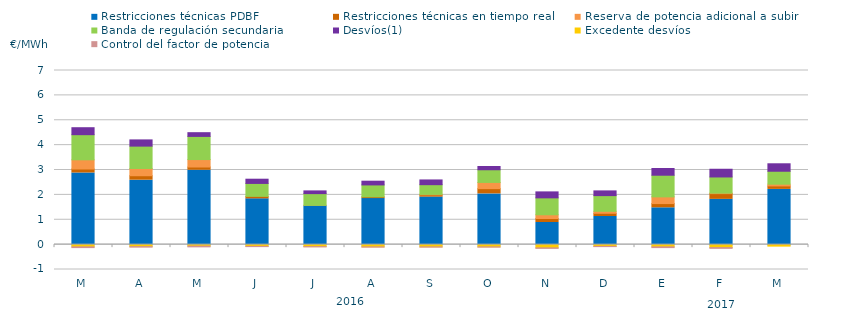
| Category | Restricciones técnicas PDBF | Restricciones técnicas en tiempo real | Reserva de potencia adicional a subir | Banda de regulación secundaria | Desvíos(1) | Excedente desvíos | Control del factor de potencia |
|---|---|---|---|---|---|---|---|
| M | 2.88 | 0.16 | 0.37 | 1.01 | 0.28 | -0.09 | -0.07 |
| A | 2.59 | 0.18 | 0.29 | 0.9 | 0.25 | -0.08 | -0.06 |
| M | 2.99 | 0.13 | 0.3 | 0.93 | 0.15 | -0.06 | -0.07 |
| J | 1.84 | 0.1 | 0 | 0.52 | 0.17 | -0.07 | -0.05 |
| J | 1.55 | 0.03 | 0 | 0.47 | 0.11 | -0.08 | -0.05 |
| A | 1.85 | 0.07 | 0 | 0.48 | 0.15 | -0.09 | -0.05 |
| S | 1.91 | 0.09 | 0.02 | 0.39 | 0.19 | -0.09 | -0.05 |
| O | 2.04 | 0.21 | 0.25 | 0.51 | 0.13 | -0.09 | -0.05 |
| N | 0.89 | 0.16 | 0.15 | 0.68 | 0.24 | -0.13 | -0.06 |
| D | 1.13 | 0.13 | 0.08 | 0.63 | 0.19 | -0.07 | -0.05 |
| E | 1.48 | 0.17 | 0.27 | 0.87 | 0.27 | -0.09 | -0.07 |
| F | 1.82 | 0.23 | 0.02 | 0.65 | 0.31 | -0.12 | -0.07 |
| M | 2.22 | 0.14 | 0.07 | 0.52 | 0.3 | -0.06 | 0 |